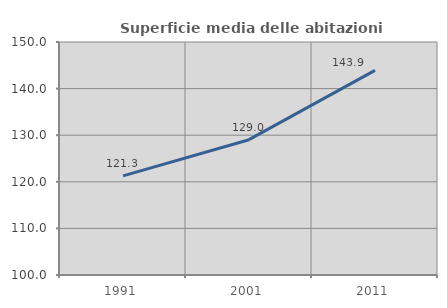
| Category | Superficie media delle abitazioni occupate |
|---|---|
| 1991.0 | 121.264 |
| 2001.0 | 129.037 |
| 2011.0 | 143.9 |